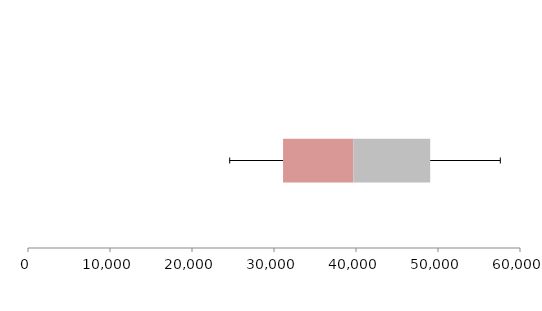
| Category | Series 1 | Series 2 | Series 3 |
|---|---|---|---|
| 0 | 31104.18 | 8580.651 | 9363.663 |